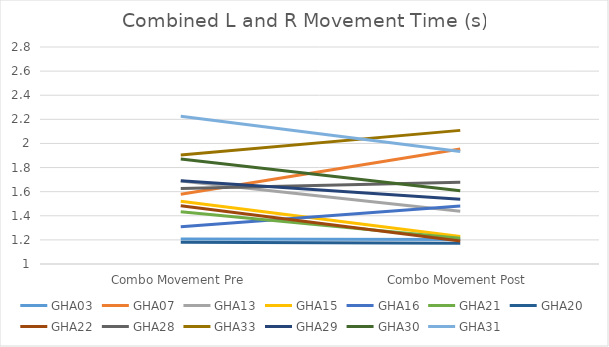
| Category | GHA03 | GHA07 | GHA13 | GHA15 | GHA16 | GHA21 | GHA20 | GHA22 | GHA28 | GHA33 | GHA29 | GHA30 | GHA31 |
|---|---|---|---|---|---|---|---|---|---|---|---|---|---|
| Combo Movement Pre | 1.207 | 1.578 | 1.689 | 1.52 | 1.308 | 1.434 | 1.18 | 1.484 | 1.627 | 1.905 | 1.691 | 1.871 | 2.225 |
| Combo Movement Post | 1.203 | 1.954 | 1.438 | 1.227 | 1.481 | 1.213 | 1.173 | 1.191 | 1.677 | 2.108 | 1.536 | 1.607 | 1.933 |